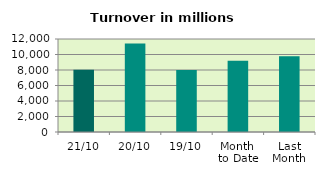
| Category | Series 0 |
|---|---|
| 21/10 | 8030.61 |
| 20/10 | 11420.576 |
| 19/10 | 8008.716 |
| Month 
to Date | 9195.786 |
| Last
Month | 9769.37 |